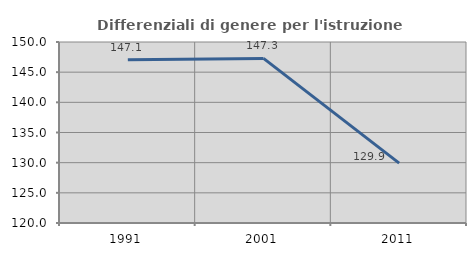
| Category | Differenziali di genere per l'istruzione superiore |
|---|---|
| 1991.0 | 147.059 |
| 2001.0 | 147.282 |
| 2011.0 | 129.921 |